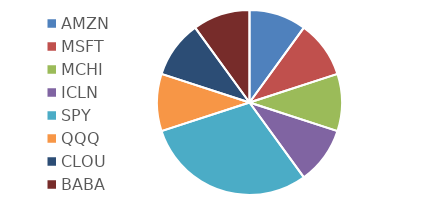
| Category | Diversificación |
|---|---|
| AMZN | 0.1 |
| MSFT | 0.1 |
| MCHI | 0.1 |
| ICLN | 0.1 |
| SPY | 0.3 |
| QQQ | 0.1 |
| CLOU | 0.1 |
| BABA | 0.1 |